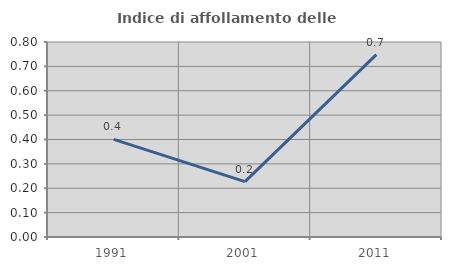
| Category | Indice di affollamento delle abitazioni  |
|---|---|
| 1991.0 | 0.401 |
| 2001.0 | 0.227 |
| 2011.0 | 0.748 |